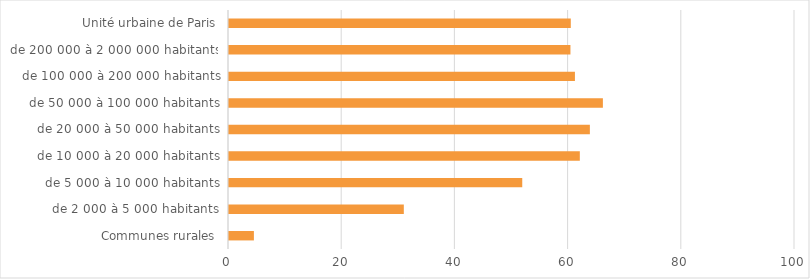
| Category | Series 0 |
|---|---|
| Communes rurales | 4.399 |
| de 2 000 à 5 000 habitants | 30.887 |
| de 5 000 à 10 000 habitants | 51.812 |
| de 10 000 à 20 000 habitants | 61.983 |
| de 20 000 à 50 000 habitants | 63.758 |
| de 50 000 à 100 000 habitants | 66.059 |
| de 100 000 à 200 000 habitants | 61.12 |
| de 200 000 à 2 000 000 habitants | 60.326 |
| Unité urbaine de Paris | 60.387 |